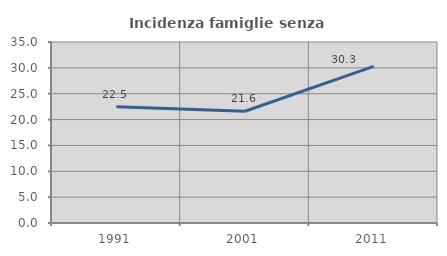
| Category | Incidenza famiglie senza nuclei |
|---|---|
| 1991.0 | 22.475 |
| 2001.0 | 21.61 |
| 2011.0 | 30.297 |